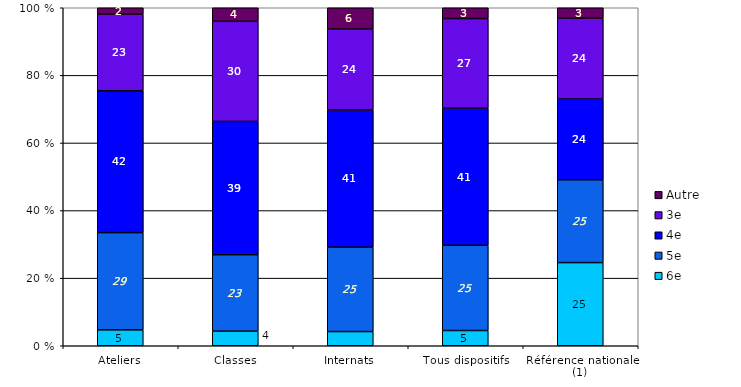
| Category | 6e | 5e | 4e | 3e | Autre |
|---|---|---|---|---|---|
| Ateliers | 4.7 | 28.7 | 41.9 | 22.6 | 1.9 |
| Classes | 4.3 | 22.6 | 39.4 | 29.6 | 4 |
| Internats | 4.2 | 25 | 40.6 | 24 | 6.3 |
| Tous dispositifs | 4.5 | 25.2 | 40.5 | 26.5 | 3.2 |
| Référence nationale (1) | 24.6 | 24.5 | 23.9 | 23.9 | 3.1 |